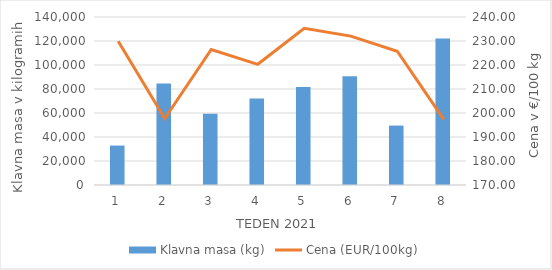
| Category | Klavna masa (kg) |
|---|---|
| 1.0 | 32871 |
| 2.0 | 84639 |
| 3.0 | 59476 |
| 4.0 | 72013 |
| 5.0 | 81759 |
| 6.0 | 90669 |
| 7.0 | 49517 |
| 8.0 | 122111 |